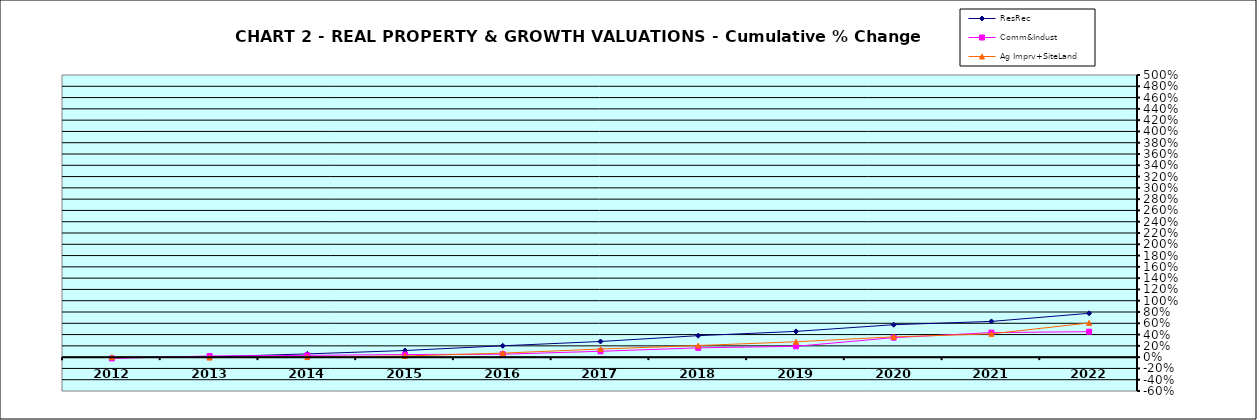
| Category | ResRec | Comm&Indust | Ag Imprv+SiteLand |
|---|---|---|---|
| 2012.0 | -0.007 | -0.023 | 0 |
| 2013.0 | 0.005 | 0.021 | -0.008 |
| 2014.0 | 0.058 | 0.031 | 0.001 |
| 2015.0 | 0.117 | 0.046 | 0.021 |
| 2016.0 | 0.201 | 0.052 | 0.071 |
| 2017.0 | 0.277 | 0.104 | 0.144 |
| 2018.0 | 0.381 | 0.165 | 0.206 |
| 2019.0 | 0.456 | 0.192 | 0.272 |
| 2020.0 | 0.575 | 0.345 | 0.359 |
| 2021.0 | 0.633 | 0.435 | 0.413 |
| 2022.0 | 0.777 | 0.451 | 0.606 |